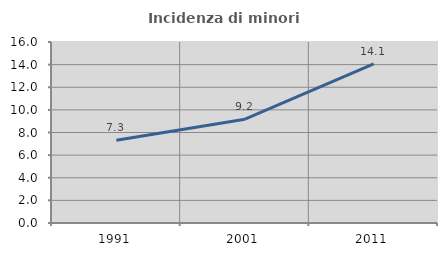
| Category | Incidenza di minori stranieri |
|---|---|
| 1991.0 | 7.317 |
| 2001.0 | 9.174 |
| 2011.0 | 14.07 |